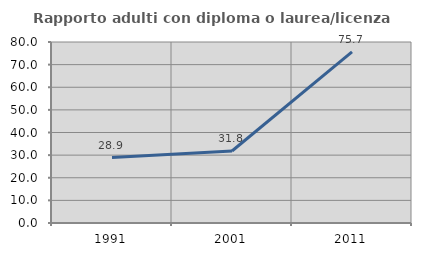
| Category | Rapporto adulti con diploma o laurea/licenza media  |
|---|---|
| 1991.0 | 28.947 |
| 2001.0 | 31.818 |
| 2011.0 | 75.676 |